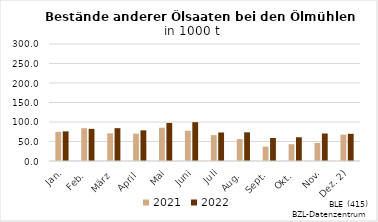
| Category | 2021 | 2022 |
|---|---|---|
| Jan. | 74.703 | 75.998 |
| Feb. | 84.177 | 82.432 |
| März | 70.84 | 84.135 |
| April | 70.174 | 78.617 |
| Mai | 85.325 | 97.677 |
| Juni | 77.473 | 99.5 |
| Juli | 66.489 | 73.136 |
| Aug. | 56.295 | 73.517 |
| Sept. | 36.787 | 59.046 |
| Okt. | 43.041 | 60.873 |
| Nov. | 46.319 | 70.434 |
| Dez. 2) | 67.596 | 69.66 |